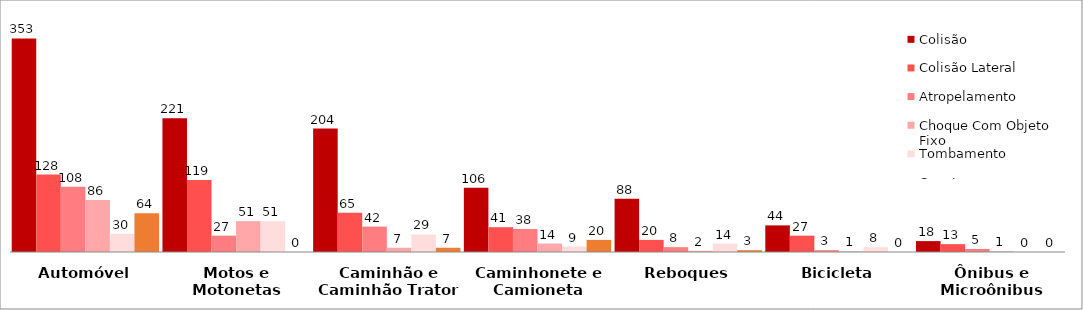
| Category | Colisão | Colisão Lateral | Atropelamento | Choque Com Objeto Fixo | Tombamento | Capotagem |
|---|---|---|---|---|---|---|
| Automóvel | 353 | 128 | 108 | 86 | 30 | 64 |
| Motos e Motonetas | 221 | 119 | 27 | 51 | 51 | 0 |
| Caminhão e Caminhão Trator | 204 | 65 | 42 | 7 | 29 | 7 |
| Caminhonete e Camioneta | 106 | 41 | 38 | 14 | 9 | 20 |
| Reboques | 88 | 20 | 8 | 2 | 14 | 3 |
| Bicicleta | 44 | 27 | 3 | 1 | 8 | 0 |
| Ônibus e Microônibus | 18 | 13 | 5 | 1 | 0 | 0 |